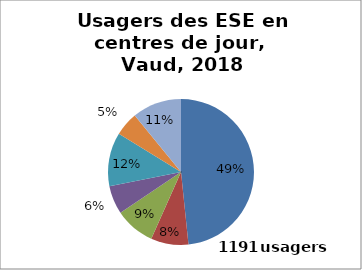
| Category | CJ |
|---|---|
| déficience intellectuelle | 576 |
| troubles psychiques | 99 |
| addiction | 106 |
| autre/hors périmètre | 75 |
| déficience physique | 142 |
| déficience sensorielle | 63 |
| polyhandicap | 130 |
| non indiqué | 0 |